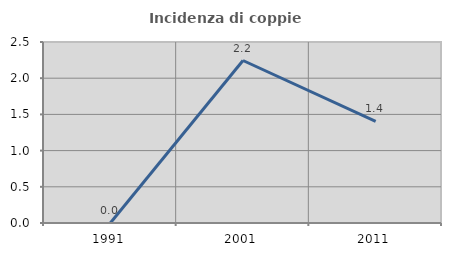
| Category | Incidenza di coppie miste |
|---|---|
| 1991.0 | 0 |
| 2001.0 | 2.244 |
| 2011.0 | 1.404 |